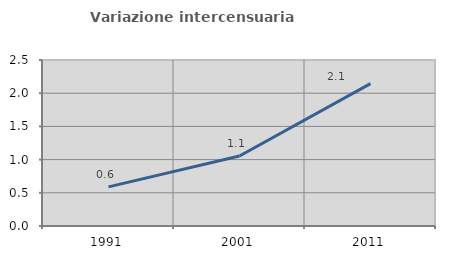
| Category | Variazione intercensuaria annua |
|---|---|
| 1991.0 | 0.589 |
| 2001.0 | 1.055 |
| 2011.0 | 2.144 |